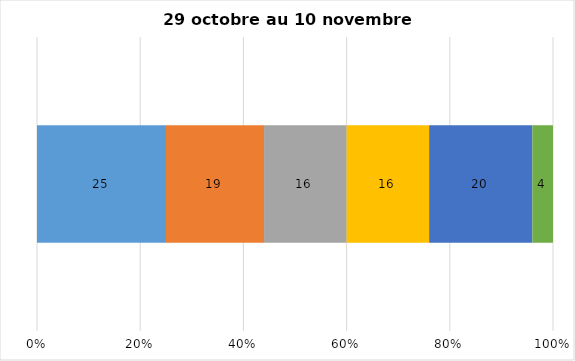
| Category | Plusieurs fois par jour | Une fois par jour | Quelques fois par semaine   | Une fois par semaine ou moins   |  Jamais   |  Je n’utilise pas les médias sociaux |
|---|---|---|---|---|---|---|
| 0 | 25 | 19 | 16 | 16 | 20 | 4 |